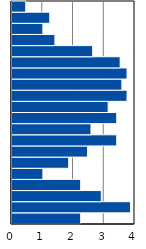
| Category | Series 0 |
|---|---|
| 0-4 | 2.233 |
| 5-9 | 3.853 |
| 10-14 | 2.903 |
| 15-19 | 2.233 |
| 20-24 | 1.005 |
| 25-29 | 1.843 |
| 30-34 | 2.457 |
| 35-39 | 3.406 |
| 40-44 | 2.568 |
| 45-49 | 3.406 |
| 50-54 | 3.127 |
| 55-59 | 3.741 |
| 60-64 | 3.573 |
| 65-69 | 3.741 |
| 70-74 | 3.518 |
| 75-79 | 2.624 |
| 80-84 | 1.396 |
| 85-89 | 1.005 |
| 90-94 | 1.228 |
| 95+ | 0.447 |